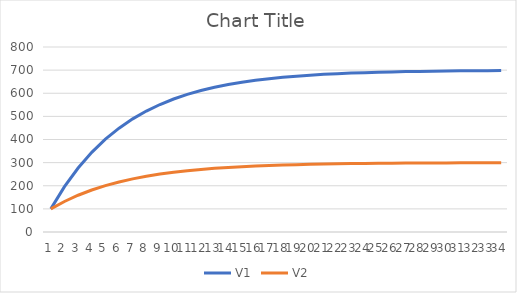
| Category | V1 | V2 |
|---|---|---|
| 0 | 100 | 100 |
| 1 | 196 | 132 |
| 2 | 276.64 | 158.88 |
| 3 | 344.378 | 181.459 |
| 4 | 401.277 | 200.426 |
| 5 | 449.073 | 216.358 |
| 6 | 489.221 | 229.74 |
| 7 | 522.946 | 240.982 |
| 8 | 551.274 | 250.425 |
| 9 | 575.071 | 258.357 |
| 10 | 595.059 | 265.02 |
| 11 | 611.85 | 270.617 |
| 12 | 625.954 | 275.318 |
| 13 | 637.801 | 279.267 |
| 14 | 647.753 | 282.584 |
| 15 | 656.113 | 285.371 |
| 16 | 663.135 | 287.712 |
| 17 | 669.033 | 289.678 |
| 18 | 673.988 | 291.329 |
| 19 | 678.15 | 292.717 |
| 20 | 681.646 | 293.882 |
| 21 | 684.582 | 294.861 |
| 22 | 687.049 | 295.683 |
| 23 | 689.121 | 296.374 |
| 24 | 690.862 | 296.954 |
| 25 | 692.324 | 297.441 |
| 26 | 693.552 | 297.851 |
| 27 | 694.584 | 298.195 |
| 28 | 695.45 | 298.483 |
| 29 | 696.178 | 298.726 |
| 30 | 696.79 | 298.93 |
| 31 | 697.303 | 299.101 |
| 32 | 697.735 | 299.245 |
| 33 | 698.097 | 299.366 |